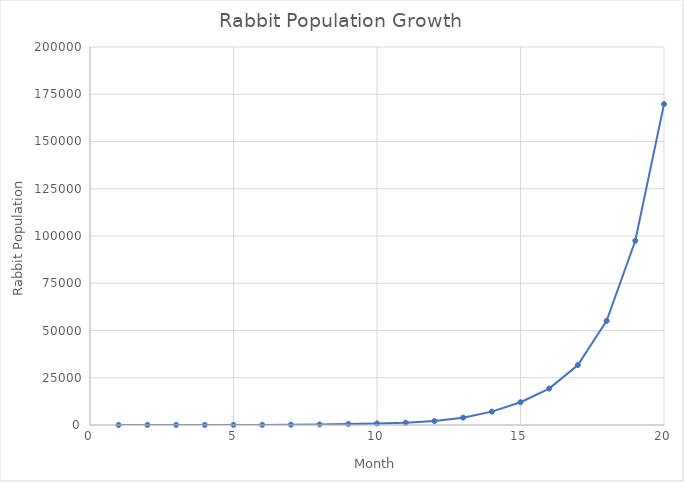
| Category | Total Rabbits |
|---|---|
| 1.0 | 2 |
| 2.0 | 14 |
| 3.0 | 26 |
| 4.0 | 38 |
| 5.0 | 50 |
| 6.0 | 62 |
| 7.0 | 146 |
| 8.0 | 302 |
| 9.0 | 530 |
| 10.0 | 830 |
| 11.0 | 1202 |
| 12.0 | 2078 |
| 13.0 | 3890 |
| 14.0 | 7070 |
| 15.0 | 12050 |
| 16.0 | 19262 |
| 17.0 | 31730 |
| 18.0 | 55070 |
| 19.0 | 97490 |
| 20.0 | 169790 |